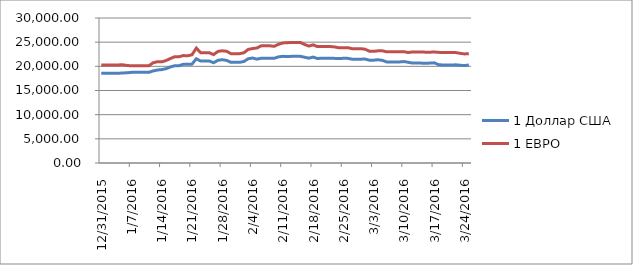
| Category | 1 Доллар США | 1 ЕВРО |
|---|---|---|
| 12/31/15 | 18569 | 20300 |
| 1/1/16 | 18569 | 20300 |
| 1/2/16 | 18569 | 20300 |
| 1/3/16 | 18569 | 20300 |
| 1/4/16 | 18569 | 20300 |
| 1/5/16 | 18628 | 20309 |
| 1/6/16 | 18667 | 20183 |
| 1/7/16 | 18752 | 20100 |
| 1/8/16 | 18752 | 20100 |
| 1/9/16 | 18752 | 20100 |
| 1/10/16 | 18752 | 20100 |
| 1/11/16 | 18752 | 20100 |
| 1/12/16 | 19048 | 20737 |
| 1/13/16 | 19234 | 20951 |
| 1/14/16 | 19326 | 20928 |
| 1/15/16 | 19514 | 21197 |
| 1/16/16 | 19864 | 21609 |
| 1/17/16 | 20132 | 21986 |
| 1/18/16 | 20132 | 21986 |
| 1/19/16 | 20419 | 22227 |
| 1/20/16 | 20412 | 22181 |
| 1/21/16 | 20461 | 22391 |
| 1/22/16 | 21564 | 23779 |
| 1/23/16 | 21095 | 22809 |
| 1/24/16 | 21095 | 22809 |
| 1/25/16 | 21095 | 22809 |
| 1/26/16 | 20746 | 22425 |
| 1/27/16 | 21251 | 23088 |
| 1/28/16 | 21365 | 23214 |
| 1/29/16 | 21234 | 23118 |
| 1/30/16 | 20823 | 22623 |
| 1/31/16 | 20823 | 22623 |
| 2/1/16 | 20823 | 22623 |
| 2/2/16 | 21006 | 22807 |
| 2/3/16 | 21568 | 23505 |
| 2/4/16 | 21718 | 23676 |
| 2/5/16 | 21486 | 23798 |
| 2/6/16 | 21668 | 24246 |
| 2/7/16 | 21668 | 24246 |
| 2/8/16 | 21668 | 24246 |
| 2/9/16 | 21660 | 24140 |
| 2/10/16 | 21959 | 24561 |
| 2/11/16 | 22069 | 24842 |
| 2/12/16 | 22034 | 24883 |
| 2/13/16 | 22065 | 24956 |
| 2/14/16 | 22065 | 24956 |
| 2/15/16 | 22065 | 24956 |
| 2/16/16 | 21892 | 24532 |
| 2/17/16 | 21686 | 24191 |
| 2/18/16 | 21914 | 24438 |
| 2/19/16 | 21616 | 24085 |
| 2/20/16 | 21683 | 24091 |
| 2/21/16 | 21683 | 24091 |
| 2/22/16 | 21683 | 24091 |
| 2/23/16 | 21644 | 24012 |
| 2/24/16 | 21610 | 23832 |
| 2/25/16 | 21664 | 23834 |
| 2/26/16 | 21648 | 23868 |
| 2/27/16 | 21482 | 23650 |
| 2/28/16 | 21482 | 23650 |
| 2/29/16 | 21482 | 23650 |
| 3/1/16 | 21506 | 23550 |
| 3/2/16 | 21277 | 23127 |
| 3/3/16 | 21275 | 23094 |
| 3/4/16 | 21362 | 23210 |
| 3/5/16 | 21235 | 23209 |
| 3/6/16 | 20913 | 23011 |
| 3/7/16 | 20913 | 23011 |
| 3/8/16 | 20913 | 23011 |
| 3/9/16 | 20913 | 23011 |
| 3/10/16 | 20985 | 23033 |
| 3/11/16 | 20838 | 22854 |
| 3/12/16 | 20666 | 22984 |
| 3/13/16 | 20666 | 22984 |
| 3/14/16 | 20666 | 22984 |
| 3/15/16 | 20616 | 22925 |
| 3/16/16 | 20675 | 22919 |
| 3/17/16 | 20725 | 22972 |
| 3/18/16 | 20344 | 22889 |
| 3/19/16 | 20278 | 22879 |
| 3/20/16 | 20278 | 22879 |
| 3/21/16 | 20278 | 22879 |
| 3/22/16 | 20313 | 22849 |
| 3/23/16 | 20219 | 22686 |
| 3/24/16 | 20161 | 22566 |
| 3/25/16 | 20278 | 22632 |